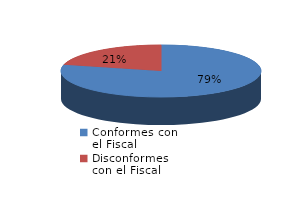
| Category | Series 0 |
|---|---|
| 0 | 1144 |
| 1 | 308 |